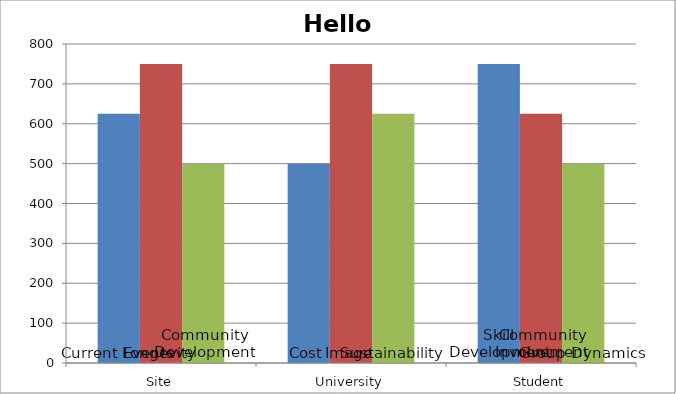
| Category | Alignment1 | Alignment2 | Alignment3 |
|---|---|---|---|
| 0 | 625 | 750 | 500 |
| 1 | 500 | 750 | 625 |
| 2 | 750 | 625 | 500 |